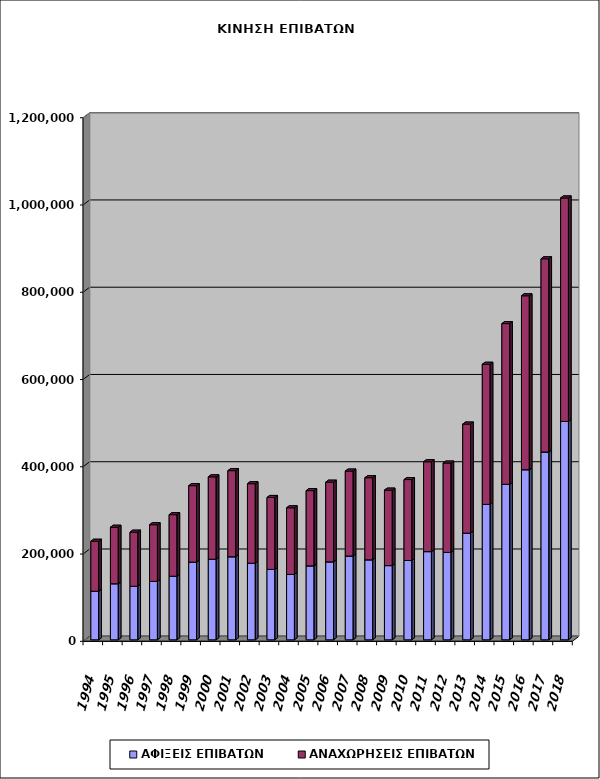
| Category | ΑΦΙΞΕΙΣ ΕΠΙΒΑΤΩΝ | ΑΝΑΧΩΡΗΣΕΙΣ ΕΠΙΒΑΤΩΝ |
|---|---|---|
| 1994.0 | 111329 | 114567 |
| 1995.0 | 128498 | 129480 |
| 1996.0 | 122653 | 124027 |
| 1997.0 | 133883 | 129852 |
| 1998.0 | 145740 | 141069 |
| 1999.0 | 177997 | 175196 |
| 2000.0 | 184681 | 188747 |
| 2001.0 | 190361 | 197298 |
| 2002.0 | 175531 | 182266 |
| 2003.0 | 161390 | 164842 |
| 2004.0 | 149988 | 152576 |
| 2005.0 | 169419 | 172494 |
| 2006.0 | 178691 | 182571 |
| 2007.0 | 192042 | 194682 |
| 2008.0 | 183339 | 188145 |
| 2009.0 | 170090 | 172978 |
| 2010.0 | 181746 | 185537 |
| 2011.0 | 202139 | 205935 |
| 2012.0 | 200271 | 204800 |
| 2013.0 | 244449 | 250017 |
| 2014.0 | 310416 | 321118 |
| 2015.0 | 356443 | 368254 |
| 2016.0 | 389817 | 398647 |
| 2017.0 | 430434 | 442837 |
| 2018.0 | 500535 | 512194 |